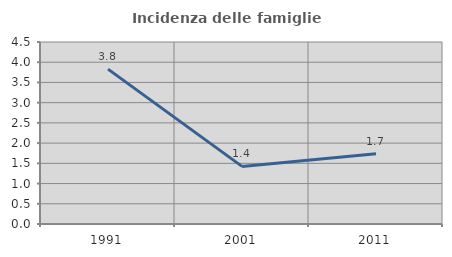
| Category | Incidenza delle famiglie numerose |
|---|---|
| 1991.0 | 3.828 |
| 2001.0 | 1.425 |
| 2011.0 | 1.738 |